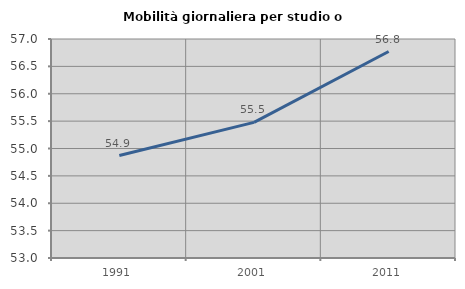
| Category | Mobilità giornaliera per studio o lavoro |
|---|---|
| 1991.0 | 54.872 |
| 2001.0 | 55.478 |
| 2011.0 | 56.771 |